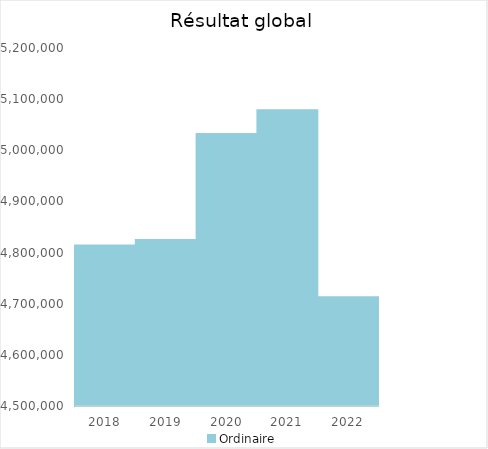
| Category |   | Ordinaire |    |
|---|---|---|---|
| 2018.0 |  | 4813823.89 |  |
| 2019.0 |  | 4824688.15 |  |
| 2020.0 |  | 5031618.37 |  |
| 2021.0 |  | 5078471.73 |  |
| 2022.0 |  | 4712589.04 |  |